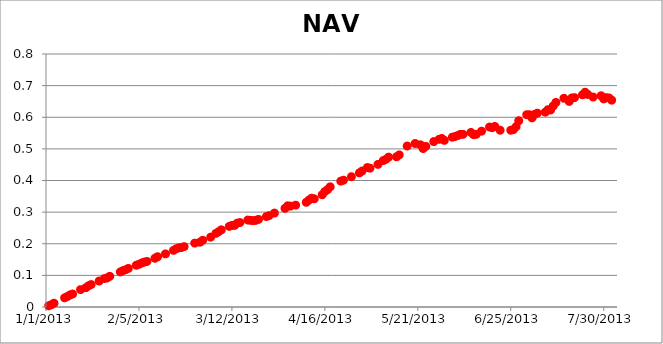
| Category | NAV Difference |
|---|---|
| 41276.0 | 0.004 |
| 41277.0 | 0.007 |
| 41278.0 | 0.012 |
| 41282.0 | 0.029 |
| 41283.0 | 0.033 |
| 41284.0 | 0.038 |
| 41285.0 | 0.041 |
| 41288.0 | 0.055 |
| 41290.0 | 0.061 |
| 41291.0 | 0.067 |
| 41292.0 | 0.071 |
| 41295.0 | 0.082 |
| 41297.0 | 0.09 |
| 41298.0 | 0.092 |
| 41299.0 | 0.097 |
| 41303.0 | 0.111 |
| 41304.0 | 0.115 |
| 41305.0 | 0.118 |
| 41306.0 | 0.122 |
| 41309.0 | 0.132 |
| 41310.0 | 0.135 |
| 41311.0 | 0.139 |
| 41312.0 | 0.142 |
| 41313.0 | 0.144 |
| 41316.0 | 0.154 |
| 41317.0 | 0.159 |
| 41320.0 | 0.168 |
| 41323.0 | 0.179 |
| 41324.0 | 0.184 |
| 41325.0 | 0.187 |
| 41326.0 | 0.188 |
| 41327.0 | 0.191 |
| 41331.0 | 0.202 |
| 41333.0 | 0.205 |
| 41334.0 | 0.211 |
| 41337.0 | 0.221 |
| 41339.0 | 0.233 |
| 41340.0 | 0.238 |
| 41341.0 | 0.244 |
| 41344.0 | 0.255 |
| 41345.0 | 0.258 |
| 41346.0 | 0.258 |
| 41347.0 | 0.265 |
| 41348.0 | 0.267 |
| 41351.0 | 0.275 |
| 41352.0 | 0.274 |
| 41353.0 | 0.273 |
| 41354.0 | 0.274 |
| 41355.0 | 0.277 |
| 41358.0 | 0.286 |
| 41359.0 | 0.289 |
| 41361.0 | 0.297 |
| 41365.0 | 0.312 |
| 41366.0 | 0.32 |
| 41367.0 | 0.319 |
| 41369.0 | 0.322 |
| 41373.0 | 0.331 |
| 41374.0 | 0.338 |
| 41375.0 | 0.344 |
| 41376.0 | 0.342 |
| 41379.0 | 0.355 |
| 41380.0 | 0.365 |
| 41381.0 | 0.371 |
| 41382.0 | 0.38 |
| 41386.0 | 0.398 |
| 41387.0 | 0.401 |
| 41390.0 | 0.412 |
| 41393.0 | 0.424 |
| 41394.0 | 0.43 |
| 41396.0 | 0.441 |
| 41397.0 | 0.439 |
| 41400.0 | 0.451 |
| 41402.0 | 0.463 |
| 41403.0 | 0.467 |
| 41404.0 | 0.474 |
| 41407.0 | 0.475 |
| 41408.0 | 0.481 |
| 41411.0 | 0.509 |
| 41414.0 | 0.517 |
| 41416.0 | 0.513 |
| 41417.0 | 0.501 |
| 41418.0 | 0.508 |
| 41421.0 | 0.523 |
| 41423.0 | 0.53 |
| 41424.0 | 0.533 |
| 41425.0 | 0.527 |
| 41428.0 | 0.537 |
| 41429.0 | 0.539 |
| 41430.0 | 0.542 |
| 41431.0 | 0.546 |
| 41432.0 | 0.546 |
| 41435.0 | 0.552 |
| 41436.0 | 0.545 |
| 41437.0 | 0.546 |
| 41439.0 | 0.556 |
| 41442.0 | 0.569 |
| 41443.0 | 0.567 |
| 41444.0 | 0.571 |
| 41446.0 | 0.559 |
| 41450.0 | 0.559 |
| 41451.0 | 0.561 |
| 41452.0 | 0.57 |
| 41453.0 | 0.589 |
| 41456.0 | 0.608 |
| 41457.0 | 0.608 |
| 41458.0 | 0.598 |
| 41459.0 | 0.609 |
| 41460.0 | 0.613 |
| 41463.0 | 0.616 |
| 41464.0 | 0.624 |
| 41465.0 | 0.623 |
| 41466.0 | 0.636 |
| 41467.0 | 0.647 |
| 41470.0 | 0.66 |
| 41472.0 | 0.65 |
| 41473.0 | 0.661 |
| 41474.0 | 0.662 |
| 41477.0 | 0.671 |
| 41478.0 | 0.679 |
| 41479.0 | 0.672 |
| 41481.0 | 0.664 |
| 41484.0 | 0.668 |
| 41485.0 | 0.658 |
| 41486.0 | 0.662 |
| 41487.0 | 0.661 |
| 41488.0 | 0.654 |